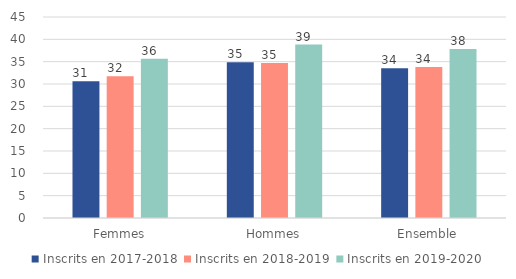
| Category | Inscrits en 2017-2018 | Inscrits en 2018-2019 | Inscrits en 2019-2020 |
|---|---|---|---|
| Femmes | 30.6 | 31.75 | 35.65 |
| Hommes | 34.87 | 34.71 | 38.83 |
| Ensemble | 33.53 | 33.79 | 37.86 |